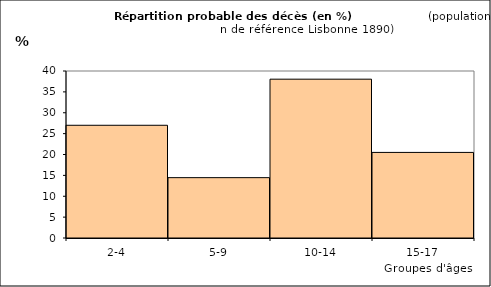
| Category | Series 0 |
|---|---|
| 2-4 | 27.002 |
| 5-9 | 14.457 |
| 10-14 | 38.04 |
| 15-17 | 20.501 |